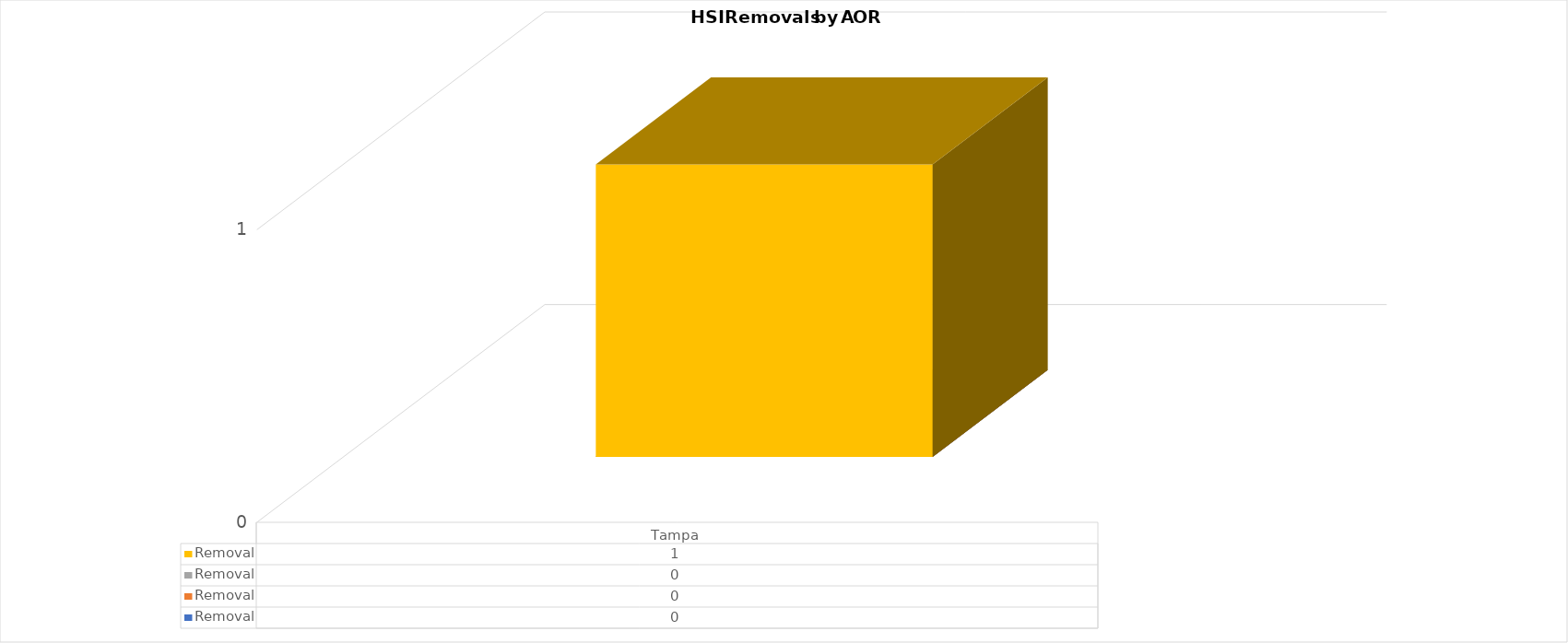
| Category | Sum of Other Priority - Removal | Sum of Public Safety - Removal | Sum of Border Security - Removal | Sum of National Security - Removal |
|---|---|---|---|---|
| Tampa | 0 | 0 | 0 | 1 |